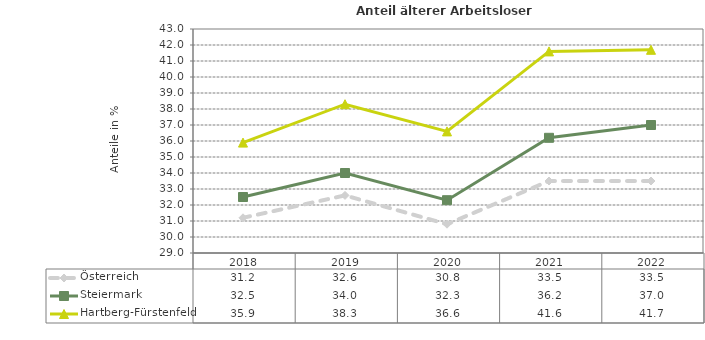
| Category | Österreich | Steiermark | Hartberg-Fürstenfeld |
|---|---|---|---|
| 2022.0 | 33.5 | 37 | 41.7 |
| 2021.0 | 33.5 | 36.2 | 41.6 |
| 2020.0 | 30.8 | 32.3 | 36.6 |
| 2019.0 | 32.6 | 34 | 38.3 |
| 2018.0 | 31.2 | 32.5 | 35.9 |